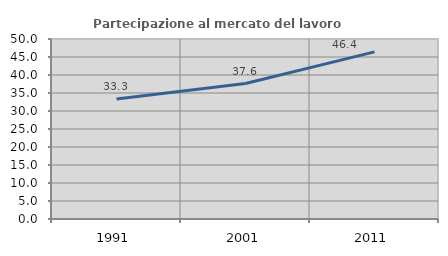
| Category | Partecipazione al mercato del lavoro  femminile |
|---|---|
| 1991.0 | 33.333 |
| 2001.0 | 37.634 |
| 2011.0 | 46.429 |